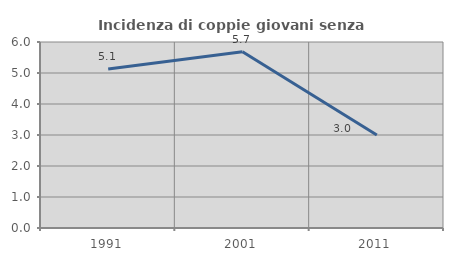
| Category | Incidenza di coppie giovani senza figli |
|---|---|
| 1991.0 | 5.128 |
| 2001.0 | 5.687 |
| 2011.0 | 3 |